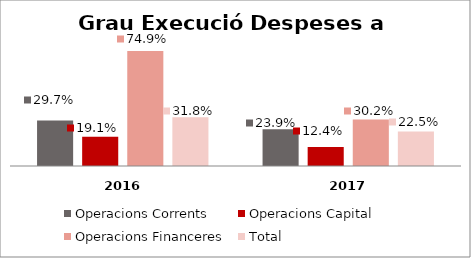
| Category | Operacions Corrents | Operacions Capital | Operacions Financeres | Total |
|---|---|---|---|---|
| 0 | 0.297 | 0.191 | 0.749 | 0.318 |
| 1 | 0.239 | 0.124 | 0.302 | 0.225 |